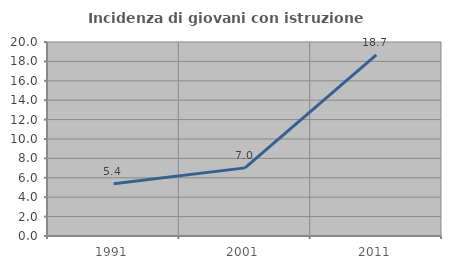
| Category | Incidenza di giovani con istruzione universitaria |
|---|---|
| 1991.0 | 5.381 |
| 2001.0 | 7.023 |
| 2011.0 | 18.661 |